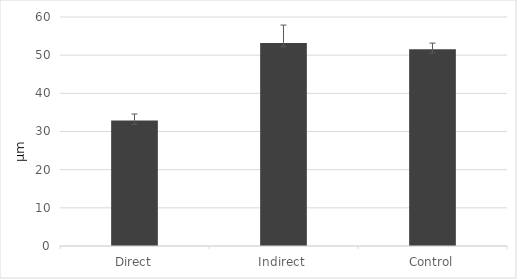
| Category | Series 0 |
|---|---|
| Direct | 32.912 |
| Indirect | 53.196 |
| Control | 51.567 |